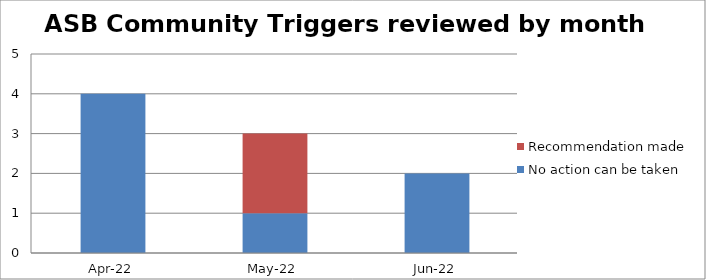
| Category | No action can be taken | Recommendation made |
|---|---|---|
| 2022-04-01 | 4 | 0 |
| 2022-05-01 | 1 | 2 |
| 2022-06-01 | 2 | 0 |